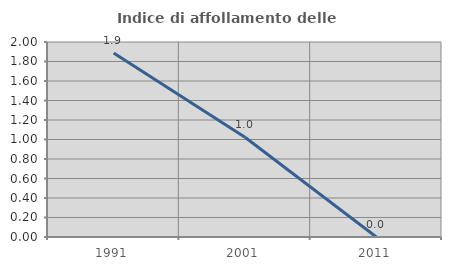
| Category | Indice di affollamento delle abitazioni  |
|---|---|
| 1991.0 | 1.887 |
| 2001.0 | 1.022 |
| 2011.0 | 0 |